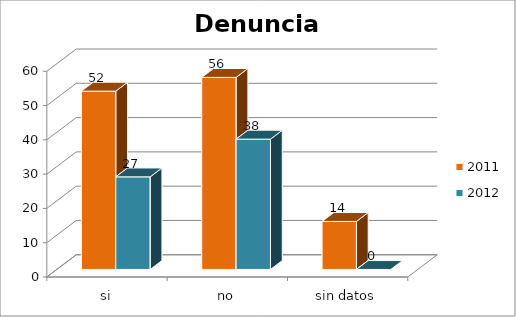
| Category | 2011 | 2012 |
|---|---|---|
| si | 52 | 27 |
| no | 56 | 38 |
| sin datos | 14 | 0 |